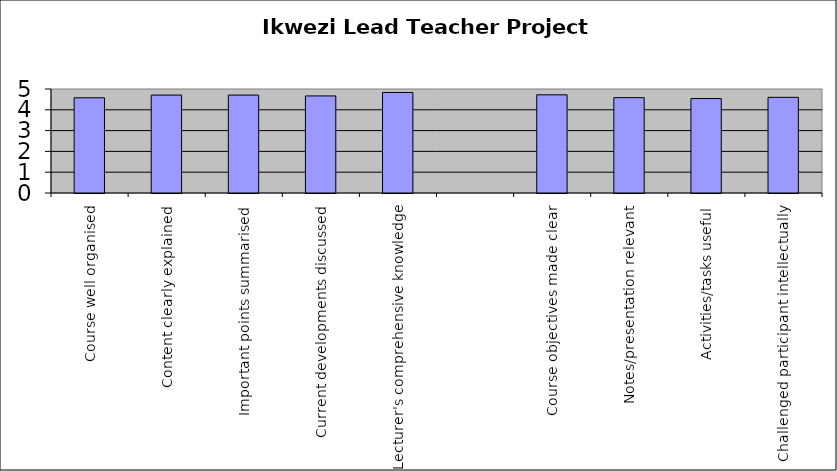
| Category | Series 0 |
|---|---|
| Course well organised | 4.577 |
| Content clearly explained | 4.708 |
| Important points summarised | 4.708 |
| Current developments discussed | 4.667 |
| Lecturer's comprehensive knowledge | 4.833 |
|  | 0 |
| Course objectives made clear | 4.72 |
| Notes/presentation relevant | 4.583 |
| Activities/tasks useful | 4.542 |
| Challenged participant intellectually | 4.6 |